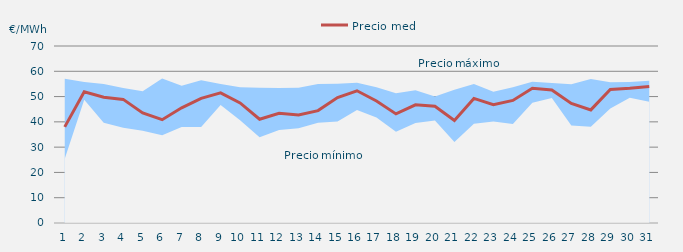
| Category | Precio medio |
|---|---|
| 1.0 | 38.018 |
| 2.0 | 51.884 |
| 3.0 | 49.764 |
| 4.0 | 48.886 |
| 5.0 | 43.554 |
| 6.0 | 40.847 |
| 7.0 | 45.567 |
| 8.0 | 49.318 |
| 9.0 | 51.466 |
| 10.0 | 47.487 |
| 11.0 | 41.048 |
| 12.0 | 43.407 |
| 13.0 | 42.678 |
| 14.0 | 44.449 |
| 15.0 | 49.639 |
| 16.0 | 52.295 |
| 17.0 | 48.266 |
| 18.0 | 43.148 |
| 19.0 | 46.757 |
| 20.0 | 46.162 |
| 21.0 | 40.533 |
| 22.0 | 49.263 |
| 23.0 | 46.754 |
| 24.0 | 48.465 |
| 25.0 | 53.301 |
| 26.0 | 52.574 |
| 27.0 | 47.303 |
| 28.0 | 44.726 |
| 29.0 | 52.791 |
| 30.0 | 53.278 |
| 31.0 | 53.938 |